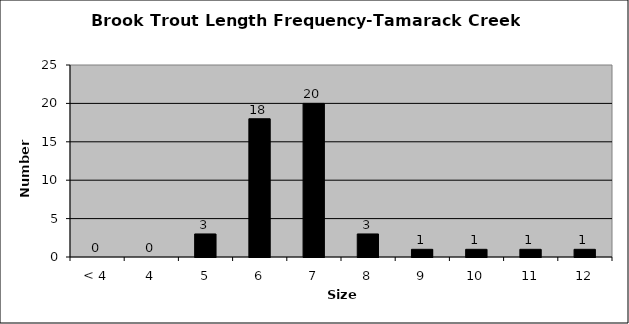
| Category | Series 0 |
|---|---|
| < 4 | 0 |
| 4 | 0 |
| 5 | 3 |
| 6 | 18 |
| 7 | 20 |
| 8 | 3 |
| 9 | 1 |
| 10 | 1 |
| 11 | 1 |
| 12 | 1 |